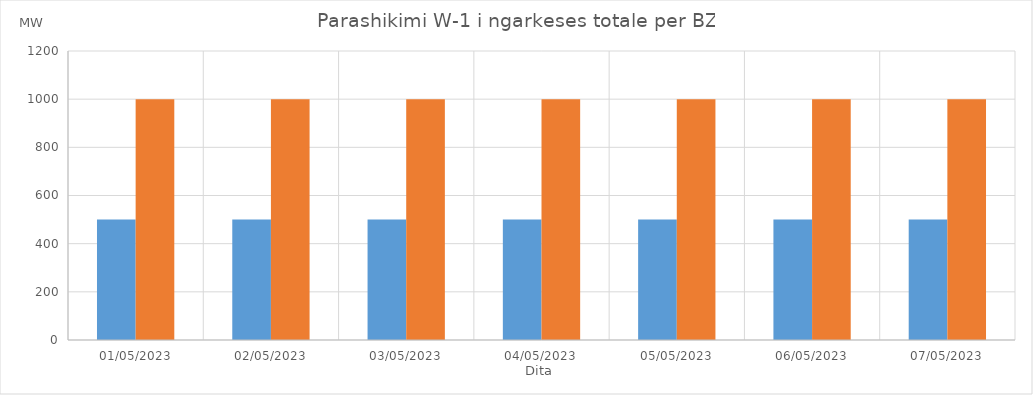
| Category | Min (MW) | Max (MW) |
|---|---|---|
| 01/05/2023 | 500 | 1000 |
| 02/05/2023 | 500 | 1000 |
| 03/05/2023 | 500 | 1000 |
| 04/05/2023 | 500 | 1000 |
| 05/05/2023 | 500 | 1000 |
| 06/05/2023 | 500 | 1000 |
| 07/05/2023 | 500 | 1000 |